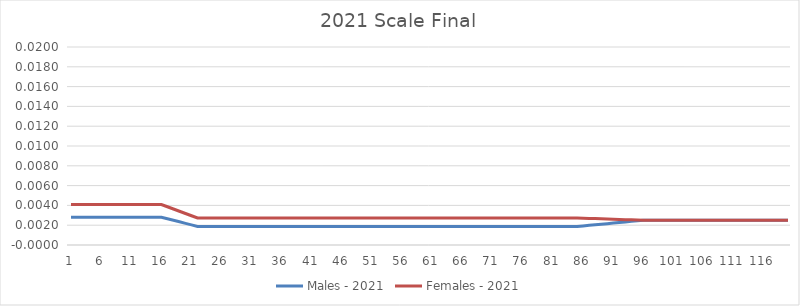
| Category |  Males - 2021  |  Females - 2021  |
|---|---|---|
| 0 | 0.003 | 0.004 |
| 1 | 0.003 | 0.004 |
| 2 | 0.003 | 0.004 |
| 3 | 0.003 | 0.004 |
| 4 | 0.003 | 0.004 |
| 5 | 0.003 | 0.004 |
| 6 | 0.003 | 0.004 |
| 7 | 0.003 | 0.004 |
| 8 | 0.003 | 0.004 |
| 9 | 0.003 | 0.004 |
| 10 | 0.003 | 0.004 |
| 11 | 0.003 | 0.004 |
| 12 | 0.003 | 0.004 |
| 13 | 0.003 | 0.004 |
| 14 | 0.003 | 0.004 |
| 15 | 0.003 | 0.004 |
| 16 | 0.003 | 0.004 |
| 17 | 0.002 | 0.004 |
| 18 | 0.002 | 0.003 |
| 19 | 0.002 | 0.003 |
| 20 | 0.002 | 0.003 |
| 21 | 0.002 | 0.003 |
| 22 | 0.002 | 0.003 |
| 23 | 0.002 | 0.003 |
| 24 | 0.002 | 0.003 |
| 25 | 0.002 | 0.003 |
| 26 | 0.002 | 0.003 |
| 27 | 0.002 | 0.003 |
| 28 | 0.002 | 0.003 |
| 29 | 0.002 | 0.003 |
| 30 | 0.002 | 0.003 |
| 31 | 0.002 | 0.003 |
| 32 | 0.002 | 0.003 |
| 33 | 0.002 | 0.003 |
| 34 | 0.002 | 0.003 |
| 35 | 0.002 | 0.003 |
| 36 | 0.002 | 0.003 |
| 37 | 0.002 | 0.003 |
| 38 | 0.002 | 0.003 |
| 39 | 0.002 | 0.003 |
| 40 | 0.002 | 0.003 |
| 41 | 0.002 | 0.003 |
| 42 | 0.002 | 0.003 |
| 43 | 0.002 | 0.003 |
| 44 | 0.002 | 0.003 |
| 45 | 0.002 | 0.003 |
| 46 | 0.002 | 0.003 |
| 47 | 0.002 | 0.003 |
| 48 | 0.002 | 0.003 |
| 49 | 0.002 | 0.003 |
| 50 | 0.002 | 0.003 |
| 51 | 0.002 | 0.003 |
| 52 | 0.002 | 0.003 |
| 53 | 0.002 | 0.003 |
| 54 | 0.002 | 0.003 |
| 55 | 0.002 | 0.003 |
| 56 | 0.002 | 0.003 |
| 57 | 0.002 | 0.003 |
| 58 | 0.002 | 0.003 |
| 59 | 0.002 | 0.003 |
| 60 | 0.002 | 0.003 |
| 61 | 0.002 | 0.003 |
| 62 | 0.002 | 0.003 |
| 63 | 0.002 | 0.003 |
| 64 | 0.002 | 0.003 |
| 65 | 0.002 | 0.003 |
| 66 | 0.002 | 0.003 |
| 67 | 0.002 | 0.003 |
| 68 | 0.002 | 0.003 |
| 69 | 0.002 | 0.003 |
| 70 | 0.002 | 0.003 |
| 71 | 0.002 | 0.003 |
| 72 | 0.002 | 0.003 |
| 73 | 0.002 | 0.003 |
| 74 | 0.002 | 0.003 |
| 75 | 0.002 | 0.003 |
| 76 | 0.002 | 0.003 |
| 77 | 0.002 | 0.003 |
| 78 | 0.002 | 0.003 |
| 79 | 0.002 | 0.003 |
| 80 | 0.002 | 0.003 |
| 81 | 0.002 | 0.003 |
| 82 | 0.002 | 0.003 |
| 83 | 0.002 | 0.003 |
| 84 | 0.002 | 0.003 |
| 85 | 0.002 | 0.003 |
| 86 | 0.002 | 0.003 |
| 87 | 0.002 | 0.003 |
| 88 | 0.002 | 0.003 |
| 89 | 0.002 | 0.003 |
| 90 | 0.002 | 0.003 |
| 91 | 0.002 | 0.003 |
| 92 | 0.002 | 0.003 |
| 93 | 0.002 | 0.003 |
| 94 | 0.002 | 0.003 |
| 95 | 0.002 | 0.002 |
| 96 | 0.002 | 0.002 |
| 97 | 0.002 | 0.002 |
| 98 | 0.002 | 0.002 |
| 99 | 0.002 | 0.002 |
| 100 | 0.002 | 0.002 |
| 101 | 0.002 | 0.002 |
| 102 | 0.002 | 0.002 |
| 103 | 0.002 | 0.002 |
| 104 | 0.002 | 0.002 |
| 105 | 0.002 | 0.002 |
| 106 | 0.002 | 0.002 |
| 107 | 0.002 | 0.002 |
| 108 | 0.002 | 0.002 |
| 109 | 0.002 | 0.002 |
| 110 | 0.002 | 0.002 |
| 111 | 0.002 | 0.002 |
| 112 | 0.002 | 0.002 |
| 113 | 0.002 | 0.002 |
| 114 | 0.002 | 0.002 |
| 115 | 0.002 | 0.002 |
| 116 | 0.002 | 0.002 |
| 117 | 0.002 | 0.002 |
| 118 | 0.002 | 0.002 |
| 119 | 0.002 | 0.002 |